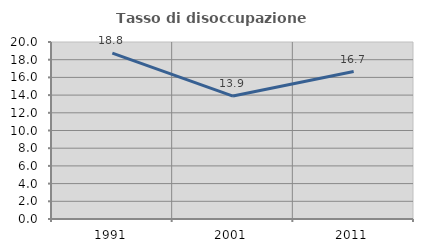
| Category | Tasso di disoccupazione giovanile  |
|---|---|
| 1991.0 | 18.75 |
| 2001.0 | 13.889 |
| 2011.0 | 16.667 |